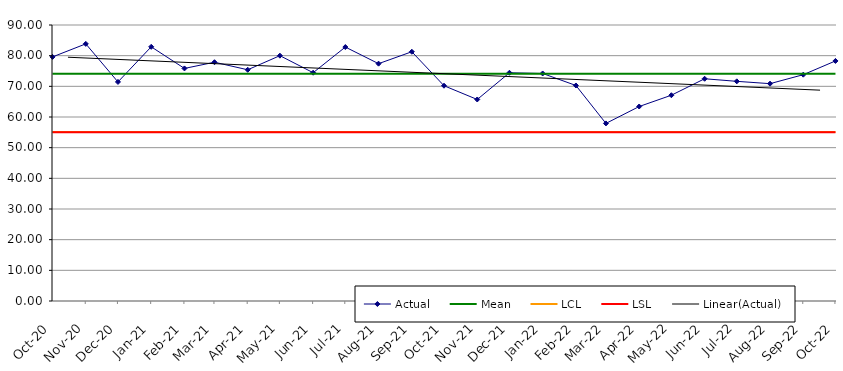
| Category | Actual | Mean | LCL | LSL |
|---|---|---|---|---|
| 2020-10-01 | 79.6 | 74.123 | 55.11 | 55 |
| 2020-11-01 | 83.85 | 74.123 | 55.11 | 55 |
| 2020-12-01 | 71.43 | 74.123 | 55.11 | 55 |
| 2021-01-01 | 82.89 | 74.123 | 55.11 | 55 |
| 2021-02-01 | 75.84 | 74.123 | 55.11 | 55 |
| 2021-03-01 | 77.86 | 74.123 | 55.11 | 55 |
| 2021-04-01 | 75.4 | 74.123 | 55.11 | 55 |
| 2021-05-01 | 80 | 74.123 | 55.11 | 55 |
| 2021-06-01 | 74.44 | 74.123 | 55.11 | 55 |
| 2021-07-01 | 82.81 | 74.123 | 55.11 | 55 |
| 2021-08-01 | 77.39 | 74.123 | 55.11 | 55 |
| 2021-09-01 | 81.28 | 74.123 | 55.11 | 55 |
| 2021-10-01 | 70.2 | 74.123 | 55.11 | 55 |
| 2021-11-01 | 65.71 | 74.123 | 55.11 | 55 |
| 2021-12-01 | 74.42 | 74.123 | 55.11 | 55 |
| 2022-01-01 | 74.19 | 74.123 | 55.11 | 55 |
| 2022-02-01 | 70.28 | 74.123 | 55.11 | 55 |
| 2022-03-01 | 57.91 | 74.123 | 55.11 | 55 |
| 2022-04-01 | 63.42 | 74.123 | 55.11 | 55 |
| 2022-05-01 | 67.1 | 74.123 | 55.11 | 55 |
| 2022-06-01 | 72.47 | 74.123 | 55.11 | 55 |
| 2022-07-01 | 71.63 | 74.123 | 55.11 | 55 |
| 2022-08-01 | 70.87 | 74.123 | 55.11 | 55 |
| 2022-09-01 | 73.8 | 74.123 | 55.11 | 55 |
| 2022-10-01 | 78.28 | 74.123 | 55.11 | 55 |